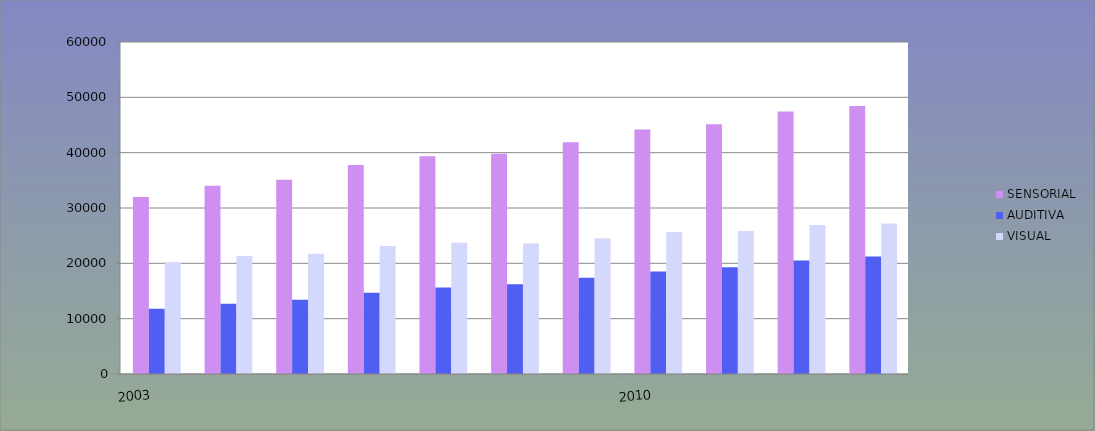
| Category | SENSORIAL | AUDITIVA | VISUAL |
|---|---|---|---|
| 2003.0 | 31981 | 11778 | 20203 |
| 2004.0 | 34042 | 12704 | 21338 |
| 2005.0 | 35119 | 13399 | 21720 |
| 2006.0 | 37778 | 14668 | 23110 |
| 2007.0 | 39358 | 15652 | 23706 |
| 2008.0 | 39811 | 16208 | 23603 |
| 2009.0 | 41895 | 17382 | 24513 |
| 2010.0 | 44182 | 18512 | 25670 |
| 2011.0 | 45114 | 19290 | 25824 |
| 2012.0 | 47447 | 20501 | 26946 |
| 2013.0 | 48437 | 21252 | 27185 |